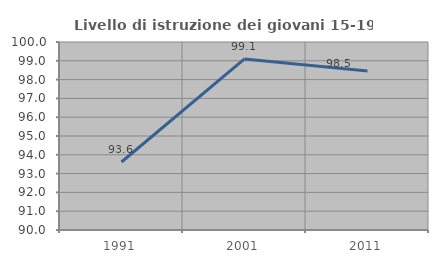
| Category | Livello di istruzione dei giovani 15-19 anni |
|---|---|
| 1991.0 | 93.617 |
| 2001.0 | 99.099 |
| 2011.0 | 98.462 |